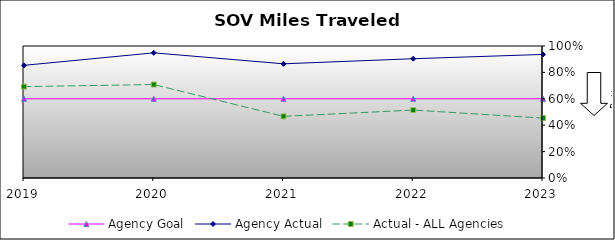
| Category | Agency Goal | Agency Actual | Actual - ALL Agencies |
|---|---|---|---|
| 2019.0 | 0.6 | 0.854 | 0.692 |
| 2020.0 | 0.6 | 0.948 | 0.708 |
| 2021.0 | 0.6 | 0.865 | 0.467 |
| 2022.0 | 0.6 | 0.904 | 0.515 |
| 2023.0 | 0.6 | 0.936 | 0.454 |